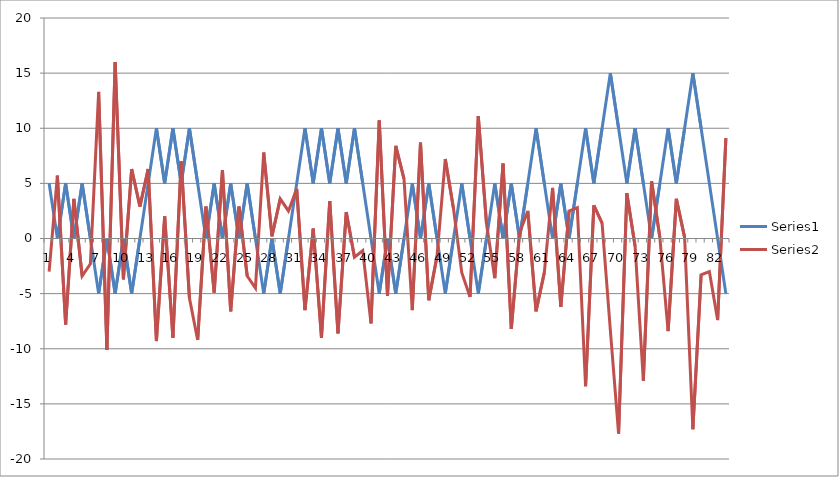
| Category | Series 0 | Series 1 |
|---|---|---|
| 0 | 5 | -3 |
| 1 | 0 | 5.7 |
| 2 | 5 | -7.8 |
| 3 | 0 | 3.6 |
| 4 | 5 | -3.4 |
| 5 | 0 | -2.3 |
| 6 | -5 | 13.3 |
| 7 | 0 | -10.1 |
| 8 | -5 | 16 |
| 9 | 0 | -3.7 |
| 10 | -5 | 6.3 |
| 11 | 0 | 2.9 |
| 12 | 5 | 6.3 |
| 13 | 10 | -9.3 |
| 14 | 5 | 2 |
| 15 | 10 | -9 |
| 16 | 5 | 7 |
| 17 | 10 | -5.4 |
| 18 | 5 | -9.2 |
| 19 | 0 | 2.9 |
| 20 | 5 | -4.9 |
| 21 | 0 | 6.2 |
| 22 | 5 | -6.6 |
| 23 | 0 | 2.9 |
| 24 | 5 | -3.4 |
| 25 | 0 | -4.5 |
| 26 | -5 | 7.8 |
| 27 | 0 | 0.2 |
| 28 | -5 | 3.6 |
| 29 | 0 | 2.5 |
| 30 | 5 | 4.5 |
| 31 | 10 | -6.5 |
| 32 | 5 | 0.9 |
| 33 | 10 | -9 |
| 34 | 5 | 3.4 |
| 35 | 10 | -8.6 |
| 36 | 5 | 2.4 |
| 37 | 10 | -1.7 |
| 38 | 5 | -1.1 |
| 39 | 0 | -7.7 |
| 40 | -5 | 10.7 |
| 41 | 0 | -5.2 |
| 42 | -5 | 8.4 |
| 43 | 0 | 5.4 |
| 44 | 5 | -6.5 |
| 45 | 0 | 8.7 |
| 46 | 5 | -5.6 |
| 47 | 0 | -1.6 |
| 48 | -5 | 7.2 |
| 49 | 0 | 2.7 |
| 50 | 5 | -3.1 |
| 51 | 0 | -5.3 |
| 52 | -5 | 11.1 |
| 53 | 0 | 1.3 |
| 54 | 5 | -3.6 |
| 55 | 0 | 6.8 |
| 56 | 5 | -8.2 |
| 57 | 0 | 0.5 |
| 58 | 5 | 2.5 |
| 59 | 10 | -6.6 |
| 60 | 5 | -3.1 |
| 61 | 0 | 4.6 |
| 62 | 5 | -6.2 |
| 63 | 0 | 2.5 |
| 64 | 5 | 2.8 |
| 65 | 10 | -13.4 |
| 66 | 5 | 3 |
| 67 | 10 | 1.4 |
| 68 | 15 | -8.3 |
| 69 | 10 | -17.7 |
| 70 | 5 | 4.1 |
| 71 | 10 | -0.7 |
| 72 | 5 | -12.9 |
| 73 | 0 | 5.2 |
| 74 | 5 | 0.1 |
| 75 | 10 | -8.4 |
| 76 | 5 | 3.6 |
| 77 | 10 | 0.1 |
| 78 | 15 | -17.3 |
| 79 | 10 | -3.3 |
| 80 | 5 | -3 |
| 81 | 0 | -7.4 |
| 82 | -5 | 9.1 |